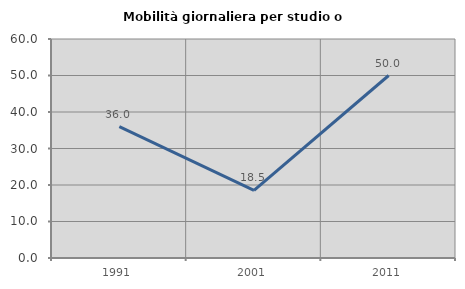
| Category | Mobilità giornaliera per studio o lavoro |
|---|---|
| 1991.0 | 36 |
| 2001.0 | 18.519 |
| 2011.0 | 50 |